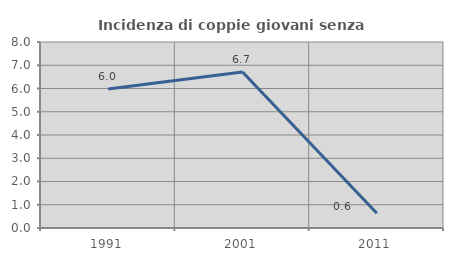
| Category | Incidenza di coppie giovani senza figli |
|---|---|
| 1991.0 | 5.978 |
| 2001.0 | 6.707 |
| 2011.0 | 0.637 |